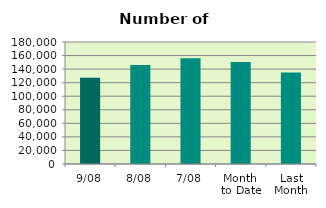
| Category | Series 0 |
|---|---|
| 9/08 | 127132 |
| 8/08 | 146072 |
| 7/08 | 155904 |
| Month 
to Date | 150458.571 |
| Last
Month | 134976 |